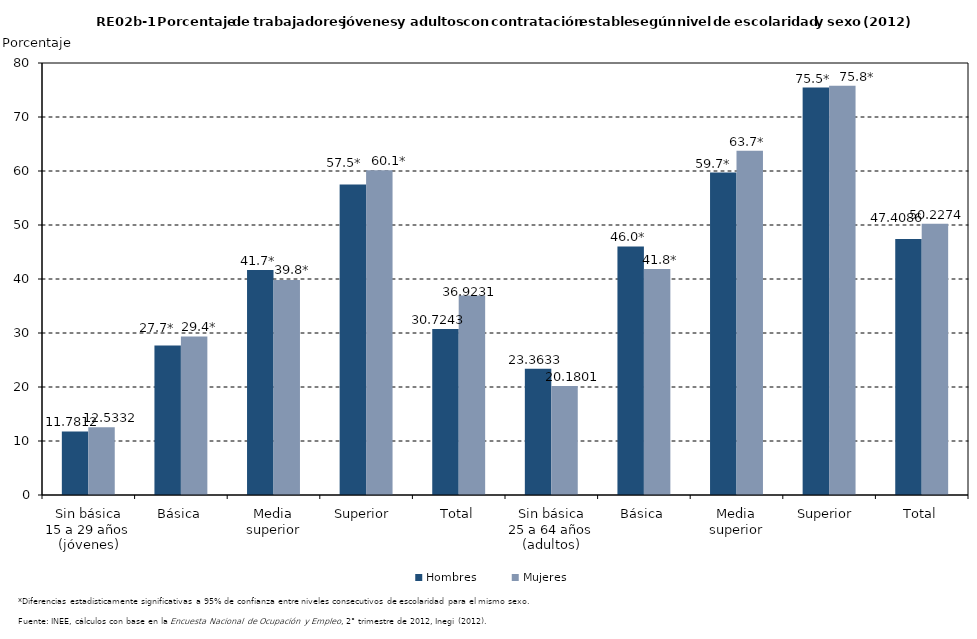
| Category | Hombres | Mujeres |
|---|---|---|
| 0 | 11.781 | 12.533 |
| 1 | 27.696 | 29.357 |
| 2 | 41.672 | 39.816 |
| 3 | 57.518 | 60.121 |
| 4 | 30.724 | 36.923 |
| 5 | 23.363 | 20.18 |
| 6 | 46.025 | 41.847 |
| 7 | 59.709 | 63.74 |
| 8 | 75.451 | 75.807 |
| 9 | 47.409 | 50.227 |